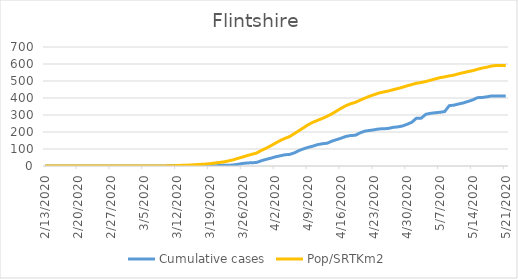
| Category | Cumulative cases | Pop/SRTKm2 |
|---|---|---|
| 5/21/20 | 412 | 591.464 |
| 5/20/20 | 412 | 591.464 |
| 5/19/20 | 412 | 591.325 |
| 5/18/20 | 412 | 588.084 |
| 5/17/20 | 407 | 581.183 |
| 5/16/20 | 403 | 576.042 |
| 5/15/20 | 402 | 568.817 |
| 5/14/20 | 389 | 560.805 |
| 5/13/20 | 380 | 555.248 |
| 5/12/20 | 371 | 548.856 |
| 5/11/20 | 365 | 542.511 |
| 5/10/20 | 358 | 534.638 |
| 5/9/20 | 355 | 530.053 |
| 5/8/20 | 320 | 524.31 |
| 5/7/20 | 316 | 519.679 |
| 5/6/20 | 313 | 512.037 |
| 5/5/20 | 310 | 504.396 |
| 5/4/20 | 304 | 497.032 |
| 5/3/20 | 281 | 491.104 |
| 5/2/20 | 281 | 486.751 |
| 5/1/20 | 257 | 479.016 |
| 4/30/20 | 245 | 471.699 |
| 4/29/20 | 235 | 462.807 |
| 4/28/20 | 230 | 455.258 |
| 4/27/20 | 227 | 448.496 |
| 4/26/20 | 221 | 440.901 |
| 4/25/20 | 219 | 435.389 |
| 4/24/20 | 218 | 429.137 |
| 4/23/20 | 213 | 419.55 |
| 4/22/20 | 209 | 410.38 |
| 4/21/20 | 205 | 398.756 |
| 4/20/20 | 195 | 387.038 |
| 4/19/20 | 181 | 374.302 |
| 4/18/20 | 179 | 366.059 |
| 4/17/20 | 174 | 354.805 |
| 4/16/20 | 164 | 339.892 |
| 4/15/20 | 155 | 323.265 |
| 4/14/20 | 146 | 306.824 |
| 4/13/20 | 134 | 292.467 |
| 4/12/20 | 131 | 280.102 |
| 4/11/20 | 126 | 268.847 |
| 4/10/20 | 117 | 257.547 |
| 4/9/20 | 110 | 243.653 |
| 4/8/20 | 101 | 225.591 |
| 4/7/20 | 91 | 207.853 |
| 4/6/20 | 77 | 190.439 |
| 4/5/20 | 68 | 172.887 |
| 4/4/20 | 66 | 162.652 |
| 4/3/20 | 60 | 149.638 |
| 4/2/20 | 54 | 134.632 |
| 4/1/20 | 46 | 119.21 |
| 3/31/20 | 39 | 104.39 |
| 3/30/20 | 31 | 91.839 |
| 3/29/20 | 21 | 76.37 |
| 3/28/20 | 19 | 69.145 |
| 3/27/20 | 18 | 61.457 |
| 3/26/20 | 15 | 52.89 |
| 3/25/20 | 10 | 44.831 |
| 3/24/20 | 6 | 36.356 |
| 3/23/20 | 4 | 30.104 |
| 3/22/20 | 4 | 24.083 |
| 3/21/20 | 3 | 20.563 |
| 3/20/20 | 1 | 17.09 |
| 3/19/20 | 1 | 13.755 |
| 3/18/20 | 1 | 10.976 |
| 3/17/20 | 1 | 9.355 |
| 3/16/20 | 1 | 7.642 |
| 3/15/20 | 1 | 6.067 |
| 3/14/20 | 1 | 4.724 |
| 3/13/20 | 1 | 3.844 |
| 3/12/20 | 1 | 2.594 |
| 3/11/20 | 1 | 1.482 |
| 3/10/20 | 1 | 0.834 |
| 3/9/20 | 0 | 0.324 |
| 3/8/20 | 0 | 0.185 |
| 3/7/20 | 0 | 0.185 |
| 3/6/20 | 0 | 0.093 |
| 3/5/20 | 0 | 0.093 |
| 3/4/20 | 0 | 0.093 |
| 3/3/20 | 0 | 0.046 |
| 3/2/20 | 0 | 0.046 |
| 3/1/20 | 0 | 0.046 |
| 2/29/20 | 0 | 0.046 |
| 2/28/20 | 0 | 0.046 |
| 2/27/20 | 0 | 0.046 |
| 2/26/20 | 0 | 0 |
| 2/25/20 | 0 | 0 |
| 2/24/20 | 0 | 0 |
| 2/23/20 | 0 | 0 |
| 2/22/20 | 0 | 0 |
| 2/21/20 | 0 | 0 |
| 2/20/20 | 0 | 0 |
| 2/19/20 | 0 | 0 |
| 2/18/20 | 0 | 0 |
| 2/17/20 | 0 | 0 |
| 2/16/20 | 0 | 0 |
| 2/15/20 | 0 | 0 |
| 2/14/20 | 0 | 0 |
| 2/13/20 | 0 | 0 |